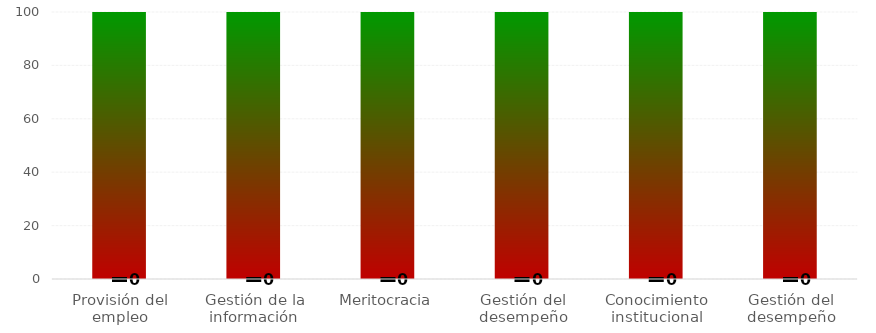
| Category | Niveles |
|---|---|
| Provisión del empleo | 100 |
| Gestión de la información | 100 |
| Meritocracia | 100 |
| Gestión del desempeño | 100 |
| Conocimiento institucional | 100 |
| Gestión del desempeño | 100 |